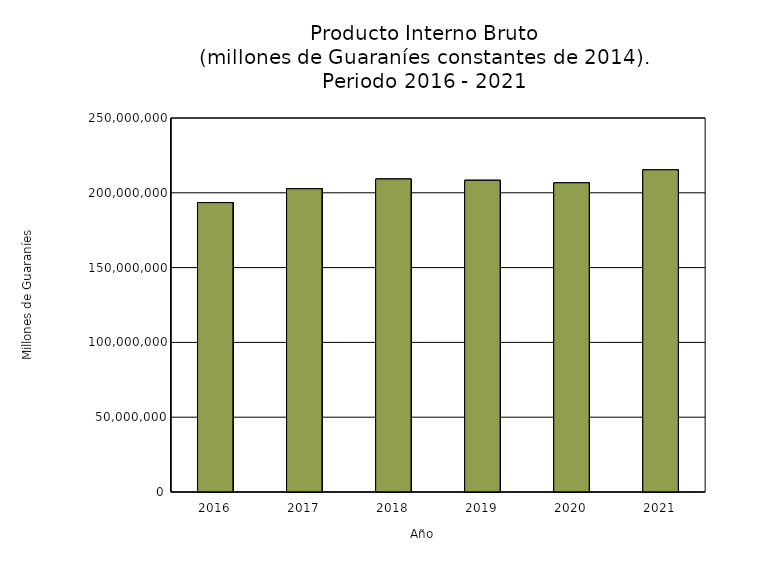
| Category | Series 0 |
|---|---|
| 2016.0 | 193419357.992 |
| 2017.0 | 202722981.633 |
| 2018.0 | 209218733.463 |
| 2019.0 | 208377977.311 |
| 2020.0 | 206669725.095 |
| 2021.0 | 215349608.989 |